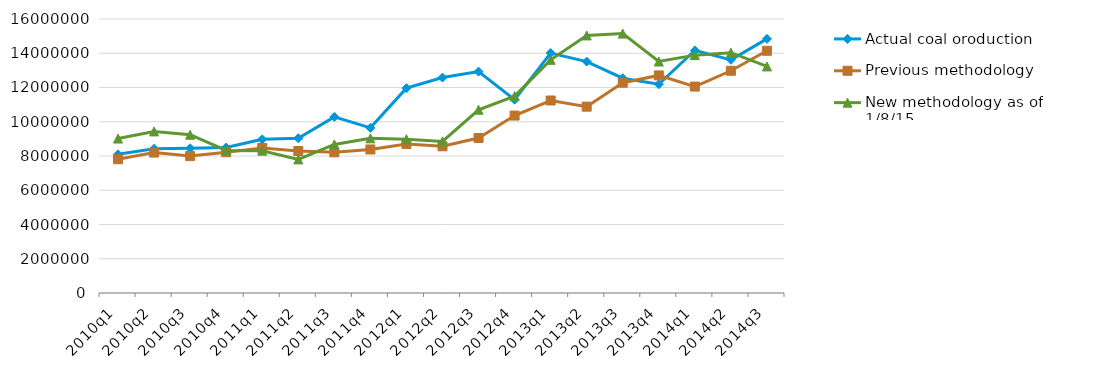
| Category | Actual coal oroduction | Previous methodology | New methodology as of 1/8/15 |
|---|---|---|---|
| 2010q1 | 8099726 | 7811115 | 9018640 |
| 2010q2 | 8422591 | 8200382 | 9434383 |
| 2010q3 | 8449740 | 7994191 | 9241721 |
| 2010q4 | 8492608 | 8218619 | 8326282 |
| 2011q1 | 8971353 | 8464518 | 8310606 |
| 2011q2 | 9038242 | 8291382 | 7799426 |
| 2011q3 | 10284483 | 8214333 | 8676028 |
| 2011q4 | 9643431 | 8382283 | 9031122 |
| 2012q1 | 11960427 | 8705795 | 8979151 |
| 2012q2 | 12581439 | 8566543 | 8854120 |
| 2012q3 | 12928994 | 9049196 | 10700405 |
| 2012q4 | 11291831 | 10361613 | 11493914 |
| 2013q1 | 14010948 | 11240261 | 13614425 |
| 2013q2 | 13513723 | 10880815 | 15039966 |
| 2013q3 | 12541912 | 12280571 | 15148478 |
| 2013q4 | 12189408 | 12705692 | 13516853 |
| 2014q1 | 14165367 | 12053598 | 13889918 |
| 2014q2 | 13615936 | 12977157 | 14032093 |
| 2014q3 | 14838253 | 14144033 | 13230823 |